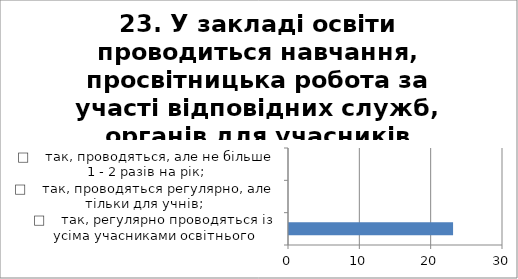
| Category | 23. У закладі освіти проводиться навчання, просвітницька робота за участі відповідних служб, органів для учасників освітного процесу з метою виявлення ознак булінгу ( цькуваннея ) та запобігання його прояву? |
|---|---|
| □    так, регулярно проводяться із усіма учасниками освітнього процесу; | 23 |
| □    так, проводяться регулярно, але тільки для учнів; | 0 |
| □    так, проводяться, але не більше 1 - 2 разів на рік; | 0 |